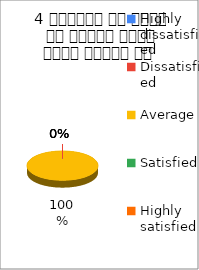
| Category | 4 शिक्षक ने विषय के प्रति रूचि रूचि जागृत की  |
|---|---|
| Highly dissatisfied | 0 |
| Dissatisfied | 0 |
| Average | 1 |
| Satisfied | 0 |
| Highly satisfied | 0 |